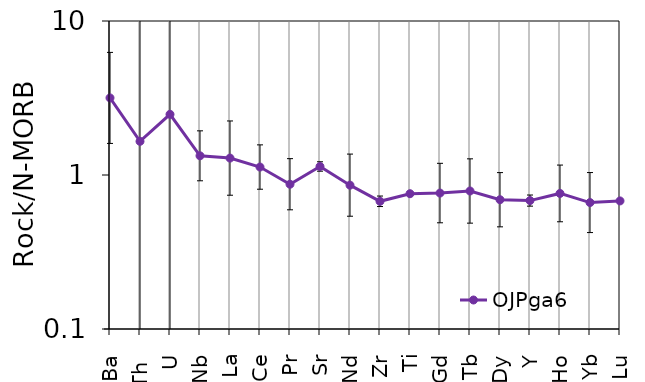
| Category | OJPga6 |
|---|---|
| Ba | 3.166 |
| Th  | 1.654 |
| U | 2.477 |
| Nb | 1.332 |
| La | 1.288 |
| Ce | 1.126 |
| Pr | 0.871 |
| Sr | 1.136 |
| Nd | 0.859 |
| Zr | 0.675 |
| Ti | 0.756 |
| Gd | 0.763 |
| Tb | 0.787 |
| Dy | 0.691 |
| Y | 0.682 |
| Ho | 0.759 |
| Yb | 0.662 |
| Lu | 0.679 |